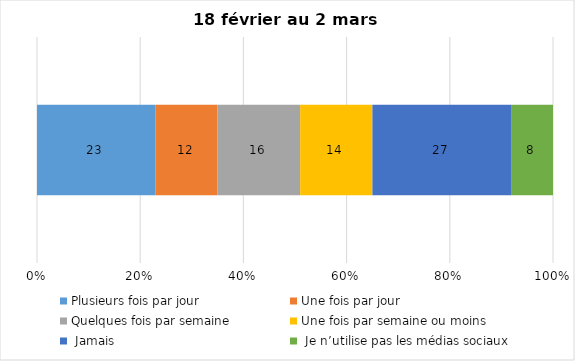
| Category | Plusieurs fois par jour | Une fois par jour | Quelques fois par semaine   | Une fois par semaine ou moins   |  Jamais   |  Je n’utilise pas les médias sociaux |
|---|---|---|---|---|---|---|
| 0 | 23 | 12 | 16 | 14 | 27 | 8 |